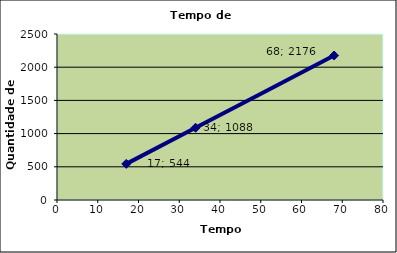
| Category | Series 0 |
|---|---|
| 17.0 | 544 |
| 34.0 | 1088 |
| 68.0 | 2176 |